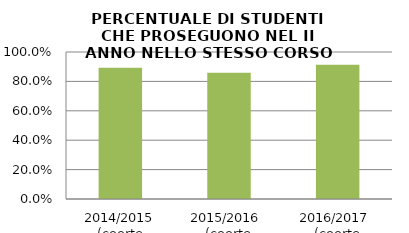
| Category | 2014/2015 (coorte 2013/14) 2015/2016  (coorte 2014/15) 2016/2017  (coorte 2015/16) |
|---|---|
| 2014/2015 (coorte 2013/14) | 0.893 |
| 2015/2016  (coorte 2014/15) | 0.858 |
| 2016/2017  (coorte 2015/16) | 0.914 |